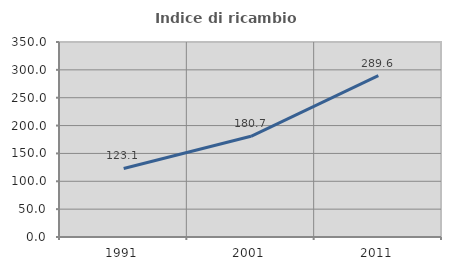
| Category | Indice di ricambio occupazionale  |
|---|---|
| 1991.0 | 123.057 |
| 2001.0 | 180.702 |
| 2011.0 | 289.575 |